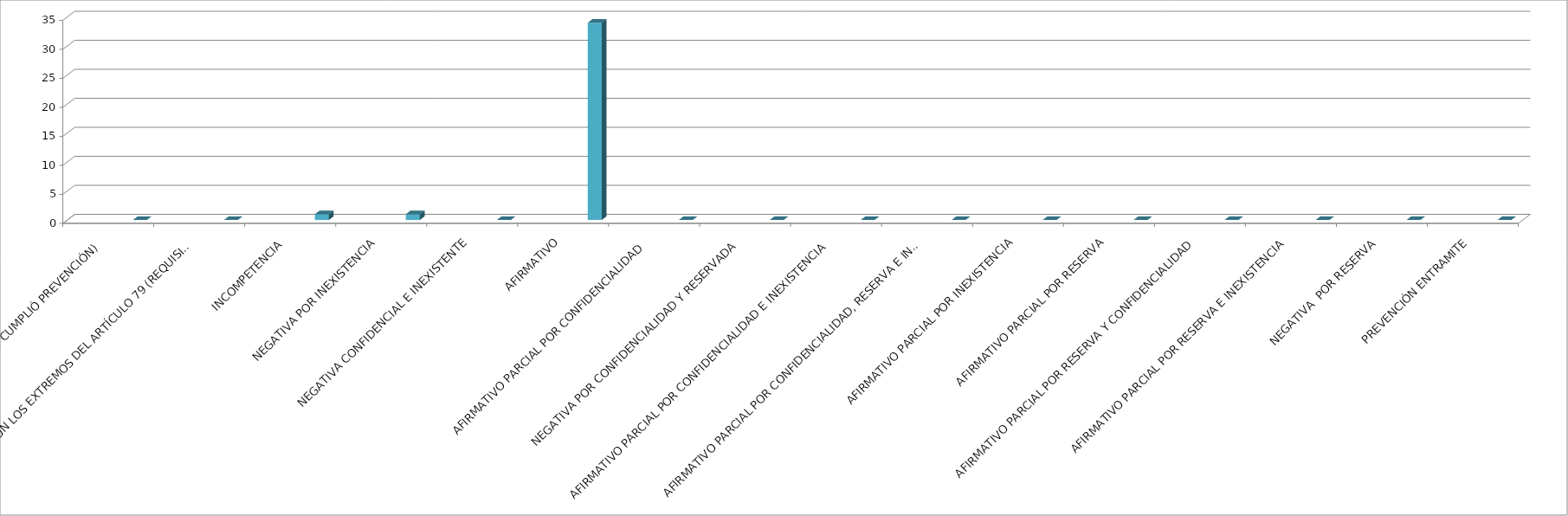
| Category | Series 0 | Series 1 | Series 2 | Series 3 | Series 4 |
|---|---|---|---|---|---|
| SE TIENE POR NO PRESENTADA ( NO CUMPLIÓ PREVENCIÓN) |  |  |  |  | 0 |
| NO CUMPLIO CON LOS EXTREMOS DEL ARTÍCULO 79 (REQUISITOS) |  |  |  |  | 0 |
| INCOMPETENCIA  |  |  |  |  | 1 |
| NEGATIVA POR INEXISTENCIA |  |  |  |  | 1 |
| NEGATIVA CONFIDENCIAL E INEXISTENTE |  |  |  |  | 0 |
| AFIRMATIVO |  |  |  |  | 34 |
| AFIRMATIVO PARCIAL POR CONFIDENCIALIDAD  |  |  |  |  | 0 |
| NEGATIVA POR CONFIDENCIALIDAD Y RESERVADA |  |  |  |  | 0 |
| AFIRMATIVO PARCIAL POR CONFIDENCIALIDAD E INEXISTENCIA |  |  |  |  | 0 |
| AFIRMATIVO PARCIAL POR CONFIDENCIALIDAD, RESERVA E INEXISTENCIA |  |  |  |  | 0 |
| AFIRMATIVO PARCIAL POR INEXISTENCIA |  |  |  |  | 0 |
| AFIRMATIVO PARCIAL POR RESERVA |  |  |  |  | 0 |
| AFIRMATIVO PARCIAL POR RESERVA Y CONFIDENCIALIDAD |  |  |  |  | 0 |
| AFIRMATIVO PARCIAL POR RESERVA E INEXISTENCIA |  |  |  |  | 0 |
| NEGATIVA  POR RESERVA |  |  |  |  | 0 |
| PREVENCIÓN ENTRAMITE |  |  |  |  | 0 |